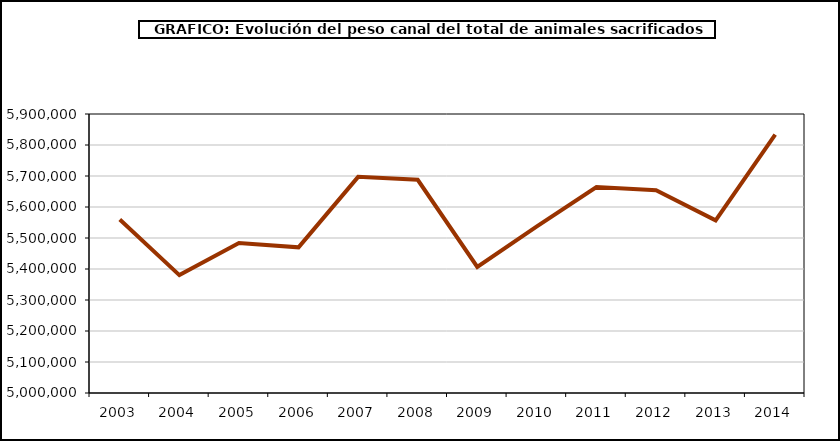
| Category | Peso canal |
|---|---|
| 2003.0 | 5559491.635 |
| 2004.0 | 5380320.91 |
| 2005.0 | 5484133.682 |
| 2006.0 | 5469928.516 |
| 2007.0 | 5697170.115 |
| 2008.0 | 5687912.363 |
| 2009.0 | 5406476.675 |
| 2010.0 | 5537415.454 |
| 2011.0 | 5664197.217 |
| 2012.0 | 5653769.803 |
| 2013.0 | 5556795.031 |
| 2014.0 | 5833789.68 |